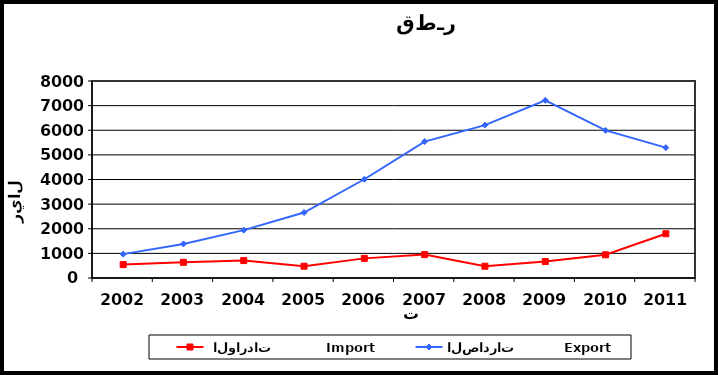
| Category |  الواردات           Import | الصادرات          Export |
|---|---|---|
| 2002.0 | 544 | 970 |
| 2003.0 | 637 | 1383 |
| 2004.0 | 708 | 1944 |
| 2005.0 | 478 | 2659 |
| 2006.0 | 797 | 4010 |
| 2007.0 | 950 | 5540 |
| 2008.0 | 478 | 6209 |
| 2009.0 | 669 | 7216 |
| 2010.0 | 942 | 5996 |
| 2011.0 | 1797 | 5294 |